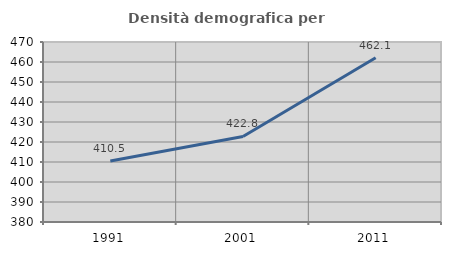
| Category | Densità demografica |
|---|---|
| 1991.0 | 410.536 |
| 2001.0 | 422.782 |
| 2011.0 | 462.131 |